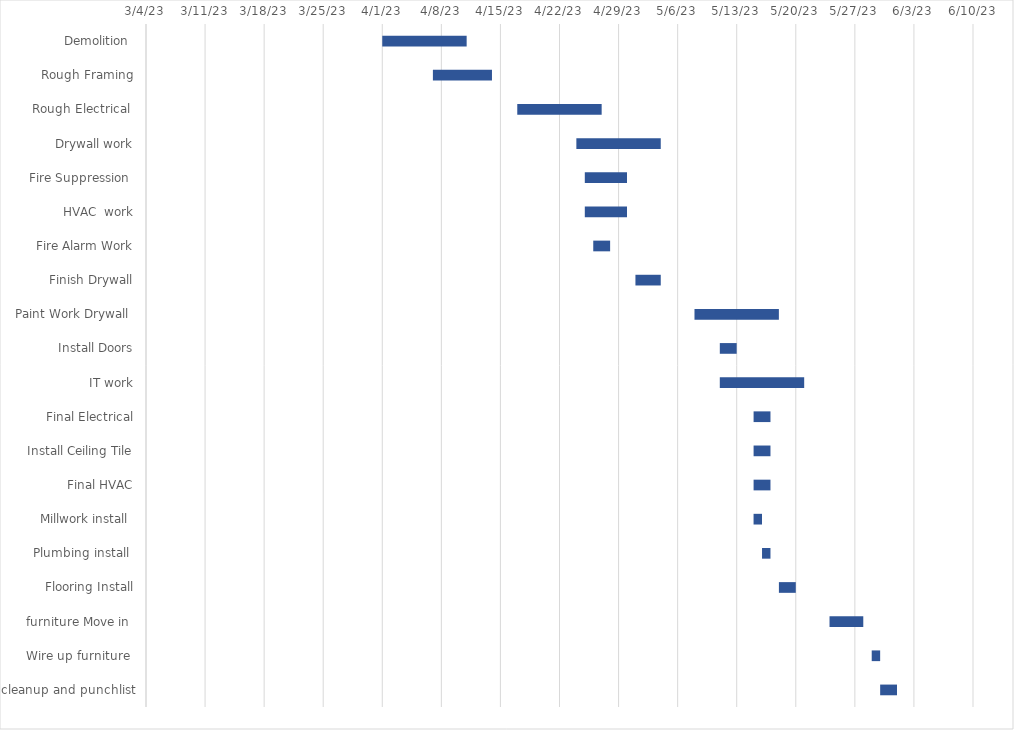
| Category | START DATE | DURATION (days) |
|---|---|---|
| Demolition  | 4/1/23 | 10 |
| Rough Framing | 4/7/23 | 7 |
| Rough Electrical  | 4/17/23 | 10 |
| Drywall work | 4/24/23 | 10 |
| Fire Suppression  | 4/25/23 | 5 |
| HVAC  work | 4/25/23 | 5 |
| Fire Alarm Work | 4/26/23 | 2 |
| Finish Drywall | 5/1/23 | 3 |
| Paint Work Drywall  | 5/8/23 | 10 |
| Install Doors | 5/11/23 | 2 |
| IT work | 5/11/23 | 10 |
| Final Electrical | 5/15/23 | 2 |
| Install Ceiling Tile | 5/15/23 | 2 |
| Final HVAC | 5/15/23 | 2 |
| Millwork install  | 5/15/23 | 1 |
| Plumbing install  | 5/16/23 | 1 |
| Flooring Install | 5/18/23 | 2 |
| furniture Move in  | 5/24/23 | 4 |
| Wire up furniture  | 5/29/23 | 1 |
| cleanup and punchlist | 5/30/23 | 2 |